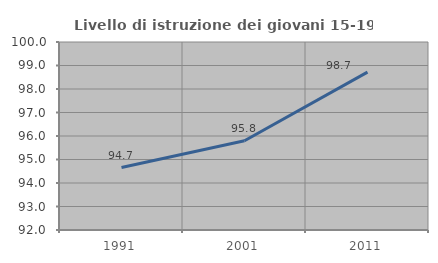
| Category | Livello di istruzione dei giovani 15-19 anni |
|---|---|
| 1991.0 | 94.656 |
| 2001.0 | 95.798 |
| 2011.0 | 98.718 |